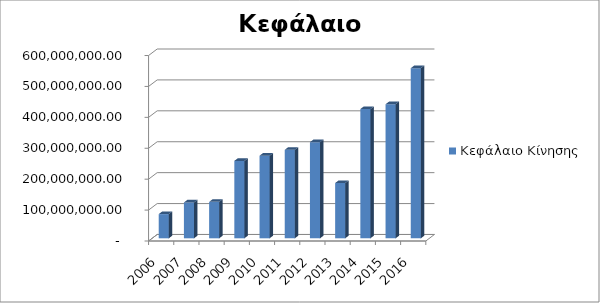
| Category | Κεφάλαιο Κίνησης |
|---|---|
| 2006.0 | 78293542 |
| 2007.0 | 115998699 |
| 2008.0 | 117846819 |
| 2009.0 | 250366907 |
| 2010.0 | 267211725 |
| 2011.0 | 286270153 |
| 2012.0 | 310948710 |
| 2013.0 | 178866897 |
| 2014.0 | 418187197 |
| 2015.0 | 433756387 |
| 2016.0 | 550368445 |